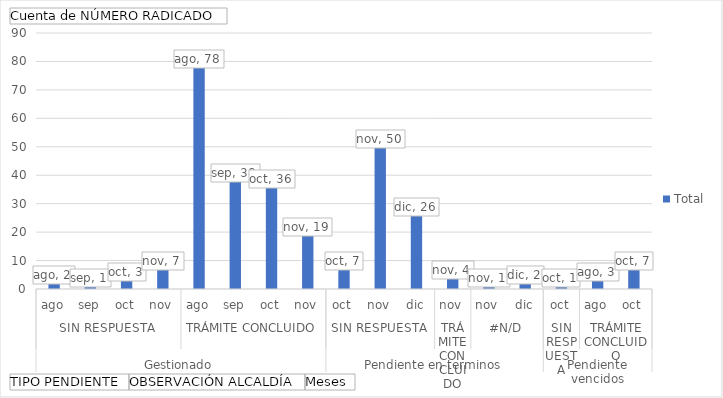
| Category | Total |
|---|---|
| 0 | 2 |
| 1 | 1 |
| 2 | 3 |
| 3 | 7 |
| 4 | 78 |
| 5 | 38 |
| 6 | 36 |
| 7 | 19 |
| 8 | 7 |
| 9 | 50 |
| 10 | 26 |
| 11 | 4 |
| 12 | 1 |
| 13 | 2 |
| 14 | 1 |
| 15 | 3 |
| 16 | 7 |